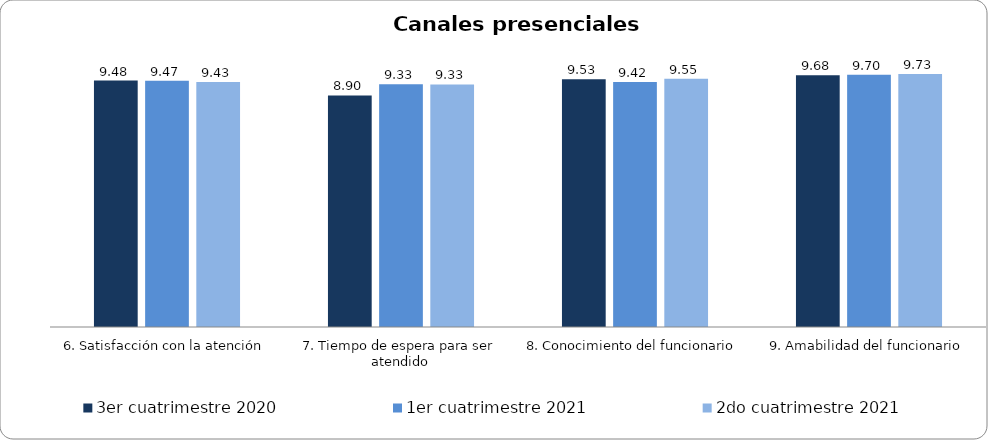
| Category | 3er cuatrimestre 2020 | Septiembre - Octubre 2018 | 1er cuatrimestre 2021 | Noviembre - Diciembre 2018 | 1er cuatrimestre 2019 | 2do cuatrimestre 2019 | 2do cuatrimestre 2021 |
|---|---|---|---|---|---|---|---|
| 6. Satisfacción con la atención | 9.476 |  | 9.474 |  |  |  | 9.425 |
| 7. Tiempo de espera para ser atendido | 8.905 |  | 9.333 |  |  |  | 9.328 |
| 8. Conocimiento del funcionario | 9.532 |  | 9.421 |  |  |  | 9.552 |
| 9. Amabilidad del funcionario | 9.683 |  | 9.702 |  |  |  | 9.731 |